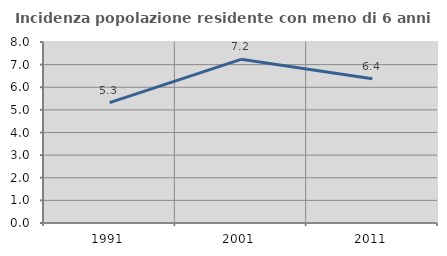
| Category | Incidenza popolazione residente con meno di 6 anni |
|---|---|
| 1991.0 | 5.324 |
| 2001.0 | 7.233 |
| 2011.0 | 6.375 |